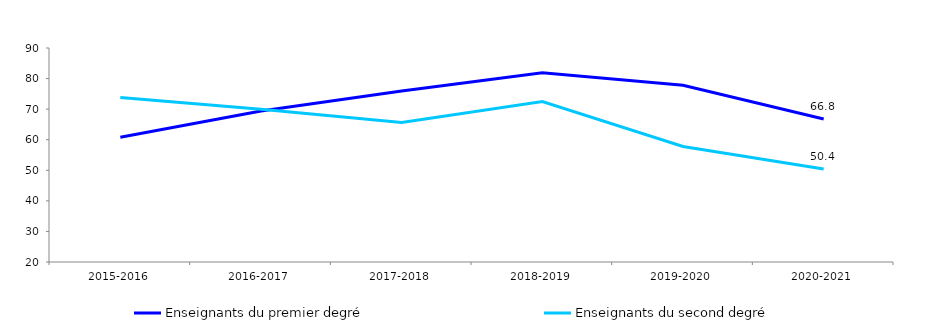
| Category | Enseignants du premier degré | Enseignants du second degré |
|---|---|---|
| 2015-2016 | 60.8 | 73.8 |
| 2016-2017 | 69.4 | 70 |
| 2017-2018 | 75.9 | 65.6 |
| 2018-2019 | 81.9 | 72.5 |
| 2019-2020 | 77.8 | 57.8 |
| 2020-2021 | 66.8 | 50.4 |